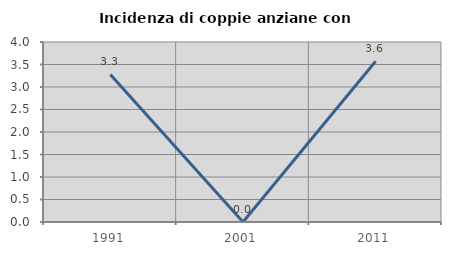
| Category | Incidenza di coppie anziane con figli |
|---|---|
| 1991.0 | 3.279 |
| 2001.0 | 0 |
| 2011.0 | 3.571 |